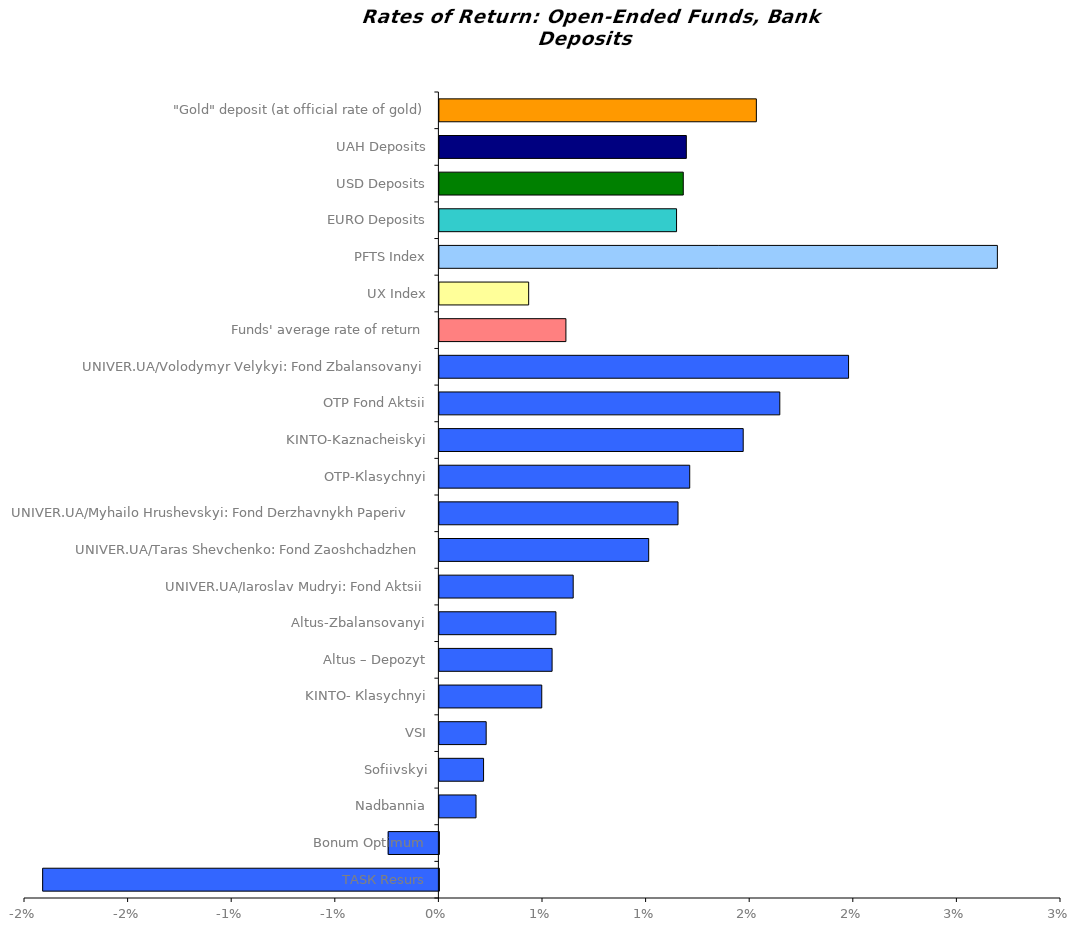
| Category | Series 0 |
|---|---|
| ТАSК Resurs | -0.019 |
| Bonum Optimum | -0.002 |
| Nadbannia | 0.002 |
| Sofiivskyi | 0.002 |
| VSI | 0.002 |
| KINTO- Кlasychnyi | 0.005 |
| Altus – Depozyt | 0.005 |
| Аltus-Zbalansovanyi | 0.006 |
| UNIVER.UA/Iaroslav Mudryi: Fond Aktsii | 0.006 |
| UNIVER.UA/Taras Shevchenko: Fond Zaoshchadzhen | 0.01 |
| UNIVER.UA/Myhailo Hrushevskyi: Fond Derzhavnykh Paperiv    | 0.012 |
| OTP-Кlasychnyi | 0.012 |
| KINTO-Kaznacheiskyi | 0.015 |
| ОТP Fond Aktsii | 0.016 |
| UNIVER.UA/Volodymyr Velykyi: Fond Zbalansovanyi | 0.02 |
| Funds' average rate of return | 0.006 |
| UX Index | 0.004 |
| PFTS Index | 0.027 |
| EURO Deposits | 0.011 |
| USD Deposits | 0.012 |
| UAH Deposits | 0.012 |
| "Gold" deposit (at official rate of gold) | 0.015 |